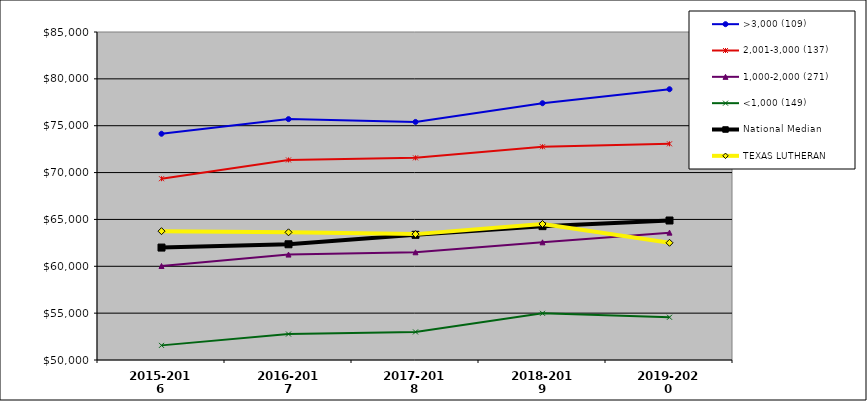
| Category | >3,000 (109) | 2,001-3,000 (137) | 1,000-2,000 (271) | <1,000 (149) | National Median | TEXAS LUTHERAN |
|---|---|---|---|---|---|---|
| 2015-2016 | 74142 | 69345 | 60030 | 51561 | 61996.5 | 63747 |
| 2016-2017 | 75705 | 71347 | 61248 | 52771 | 62349 | 63624 |
| 2017-2018 | 75404 | 71571 | 61495 | 52996 | 63357 | 63432 |
| 2018-2019 | 77399 | 72757 | 62557 | 54981 | 64282.5 | 64514 |
| 2019-2020 | 78893 | 73068 | 63591 | 54563 | 64884.5 | 62508 |